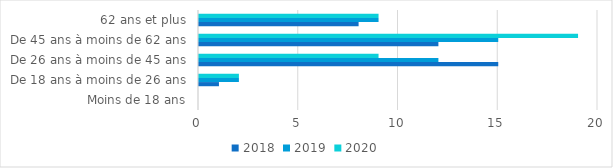
| Category | 2018 | 2019 | 2020 |
|---|---|---|---|
| Moins de 18 ans | 0 | 0 | 0 |
| De 18 ans à moins de 26 ans | 1 | 2 | 2 |
| De 26 ans à moins de 45 ans | 15 | 12 | 9 |
| De 45 ans à moins de 62 ans | 12 | 15 | 19 |
| 62 ans et plus | 8 | 9 | 9 |